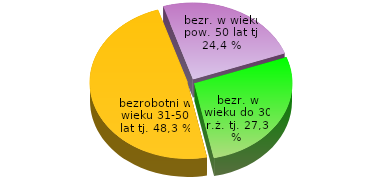
| Category | Series 0 |
|---|---|
| do 30 | 27.346 |
| 31-50 | 48.294 |
| pow.50 | 24.36 |